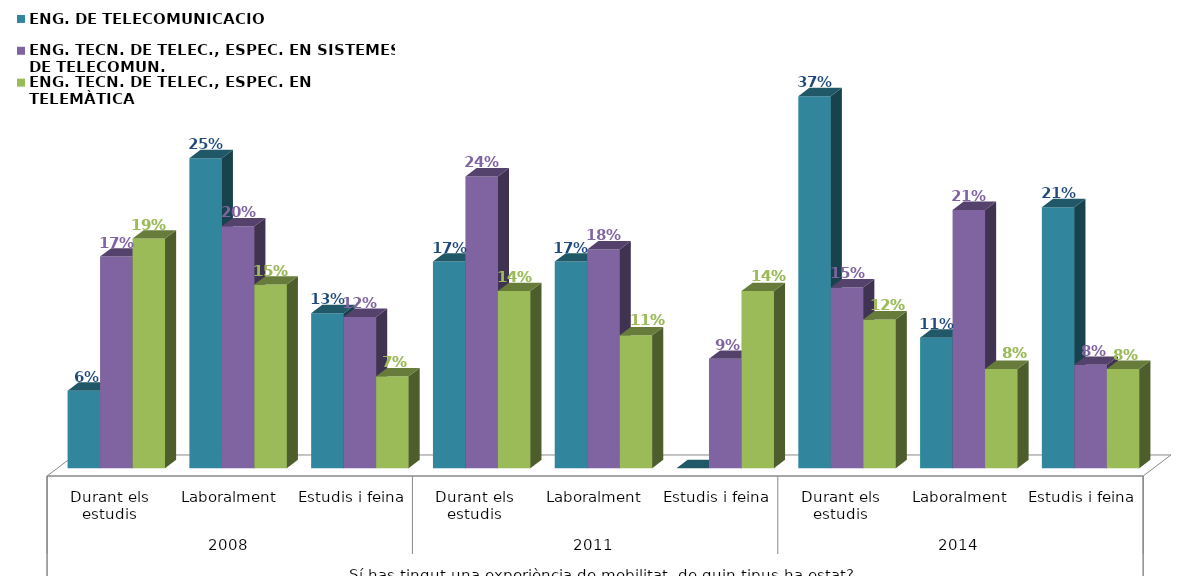
| Category | ENG. DE TELECOMUNICACIÓ | ENG. TECN. DE TELEC., ESPEC. EN SISTEMES DE TELECOMUN. | ENG. TECN. DE TELEC., ESPEC. EN TELEMÀTICA |
|---|---|---|---|
| 0 | 0.062 | 0.171 | 0.185 |
| 1 | 0.25 | 0.195 | 0.148 |
| 2 | 0.125 | 0.122 | 0.074 |
| 3 | 0.167 | 0.235 | 0.143 |
| 4 | 0.167 | 0.176 | 0.107 |
| 5 | 0 | 0.088 | 0.143 |
| 6 | 0.368 | 0.146 | 0.12 |
| 7 | 0.105 | 0.208 | 0.08 |
| 8 | 0.211 | 0.083 | 0.08 |